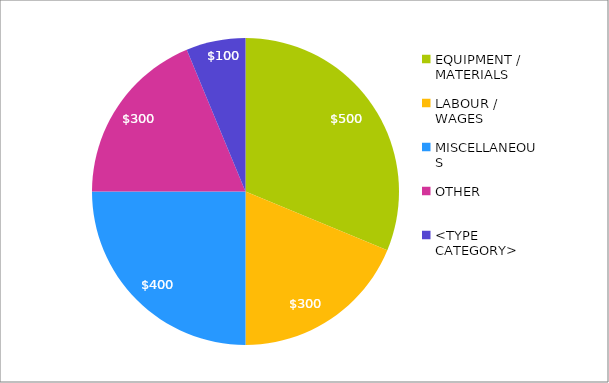
| Category | Series 0 |
|---|---|
| EQUIPMENT / MATERIALS | 500 |
| LABOUR / WAGES | 300 |
| MISCELLANEOUS | 400 |
| OTHER | 300 |
| <TYPE CATEGORY> | 100 |